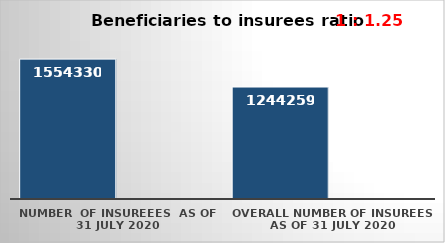
| Category | Series 0 | Series 1 |
|---|---|---|
| NUMBER  of insureees  as of  31 July 2020 | 1554330 |  |
| OVERALL number of insurees as of 31 July 2020 | 1244259 |  |